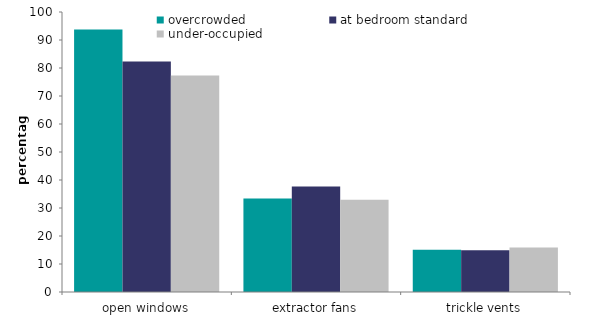
| Category | overcrowded | at bedroom standard | under-occupied |
|---|---|---|---|
| open windows | 93.781 | 82.292 | 77.312 |
| extractor fans | 33.352 | 37.649 | 32.954 |
| trickle vents | 15.045 | 14.906 | 15.877 |